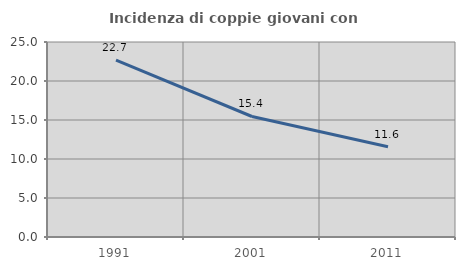
| Category | Incidenza di coppie giovani con figli |
|---|---|
| 1991.0 | 22.673 |
| 2001.0 | 15.449 |
| 2011.0 | 11.562 |